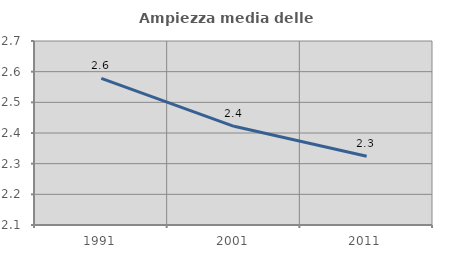
| Category | Ampiezza media delle famiglie |
|---|---|
| 1991.0 | 2.578 |
| 2001.0 | 2.422 |
| 2011.0 | 2.324 |